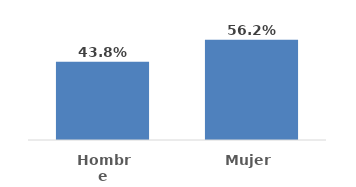
| Category | Series 0 |
|---|---|
| Hombre | 0.438 |
| Mujer | 0.562 |